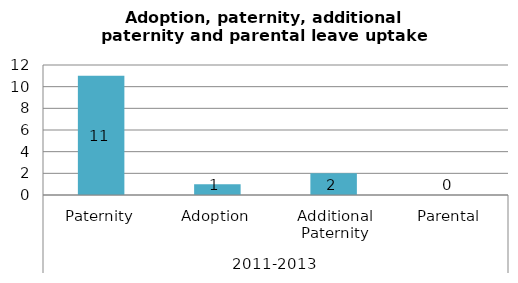
| Category | Series 0 |
|---|---|
| 0 | 11 |
| 1 | 1 |
| 2 | 2 |
| 3 | 0 |